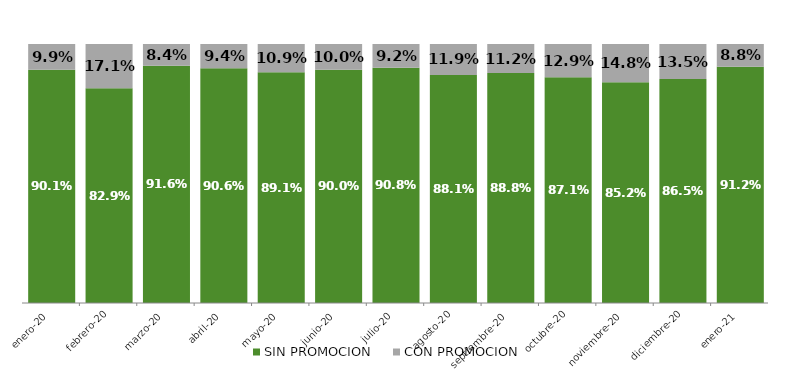
| Category | SIN PROMOCION   | CON PROMOCION   |
|---|---|---|
| 2020-01-01 | 0.901 | 0.099 |
| 2020-02-01 | 0.829 | 0.171 |
| 2020-03-01 | 0.916 | 0.084 |
| 2020-04-01 | 0.906 | 0.094 |
| 2020-05-01 | 0.891 | 0.109 |
| 2020-06-01 | 0.9 | 0.1 |
| 2020-07-01 | 0.908 | 0.092 |
| 2020-08-01 | 0.881 | 0.119 |
| 2020-09-01 | 0.888 | 0.112 |
| 2020-10-01 | 0.871 | 0.129 |
| 2020-11-01 | 0.852 | 0.148 |
| 2020-12-01 | 0.865 | 0.135 |
| 2021-01-01 | 0.912 | 0.088 |